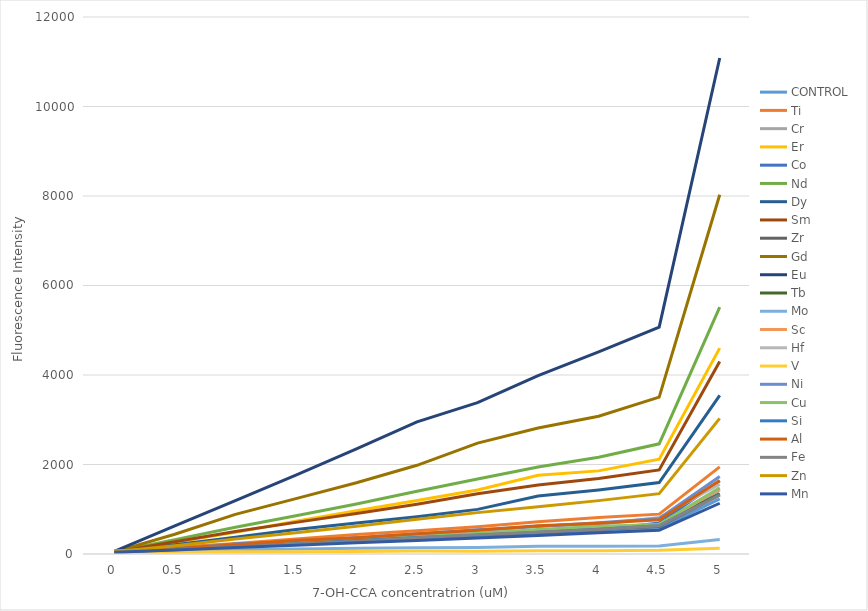
| Category | CONTROL | Ti | Cr | Er | Co | Nd | Dy | Sm | Zr | Gd | Eu | Tb | Mo | Sc | Hf | V | Ni | Cu | Si | Al | Fe | Zn | Mn |
|---|---|---|---|---|---|---|---|---|---|---|---|---|---|---|---|---|---|---|---|---|---|---|---|
| 0.0 | 39.667 | 56.333 | 40 | 38.667 | 37.667 | 49.667 | 44.667 | 47.333 | 48.667 | 48.333 | 56.333 | 35.667 | 69.667 | 48 | 53.333 | 37 | 36.333 | 40.333 | 41.333 | 39 | 36.667 | 50.333 | 40.667 |
| 0.5 | 103.333 | 151.667 | 113 | 261.333 | 97.667 | 321.667 | 208.333 | 272.667 | 112.667 | 442.333 | 626.667 | 99.333 | 83.667 | 120.333 | 125.667 | 46.333 | 119 | 107.333 | 106 | 123 | 94.667 | 186.667 | 88.333 |
| 1.0 | 157.333 | 236.333 | 185 | 483 | 222.667 | 599.667 | 372.667 | 503.667 | 179.333 | 885.333 | 1194.333 | 181 | 97 | 180.667 | 200.667 | 48.333 | 216.333 | 174.333 | 166.333 | 206.333 | 156 | 333.667 | 143 |
| 1.5 | 217.667 | 333 | 246.333 | 732.333 | 269.333 | 852.667 | 548.333 | 707 | 247 | 1237 | 1763.333 | 240.667 | 112 | 257 | 277.333 | 50 | 276 | 250 | 228.667 | 301.667 | 223.333 | 474.333 | 196.333 |
| 2.0 | 271 | 437 | 307.667 | 968.333 | 357.333 | 1116.667 | 691 | 903.333 | 307.333 | 1593 | 2349 | 303 | 126 | 329 | 350 | 57.667 | 362.333 | 314 | 300.333 | 363.667 | 284 | 619 | 248.667 |
| 2.5 | 330.333 | 518 | 384.333 | 1194.667 | 383.333 | 1403.333 | 830.333 | 1110.333 | 376 | 1982 | 2954.333 | 380.333 | 139.667 | 396 | 413.667 | 64.667 | 444.667 | 383.667 | 370 | 450.667 | 363.333 | 776.667 | 300.333 |
| 3.0 | 380.667 | 607.333 | 455.667 | 1429 | 431 | 1675.667 | 997.333 | 1348 | 428.333 | 2479 | 3383.667 | 442 | 145.333 | 458 | 491.333 | 63.333 | 543 | 460.667 | 420.667 | 531.667 | 432.333 | 924.667 | 355.667 |
| 3.5 | 453.667 | 723.333 | 512.667 | 1758.333 | 471 | 1943.667 | 1296.333 | 1542 | 496 | 2816.333 | 3988.333 | 493.333 | 171.667 | 530.667 | 624.333 | 72 | 614.667 | 546 | 483.333 | 630.333 | 488.667 | 1057.667 | 413.667 |
| 4.0 | 507.667 | 818.333 | 565.667 | 1857.333 | 537 | 2164 | 1431 | 1687.333 | 554.333 | 3079.333 | 4515.333 | 579 | 174.333 | 606.333 | 659 | 73.333 | 697.333 | 616 | 555.333 | 686.333 | 547 | 1192.667 | 474 |
| 4.5 | 571.333 | 890.667 | 647 | 2119.667 | 690.667 | 2462 | 1595.333 | 1878.333 | 614.667 | 3505.333 | 5068.667 | 649.667 | 180.333 | 661 | 815.667 | 83.333 | 795.333 | 662 | 628.667 | 764 | 630 | 1349.333 | 531.333 |
| 5.0 | 1231.333 | 1947.667 | 1439.333 | 4600 | 1633.667 | 5518.333 | 3544 | 4302.667 | 1318.333 | 8027 | 11084.333 | 1348.667 | 324.333 | 1456 | 1561.667 | 131 | 1732 | 1479 | 1328.667 | 1643.333 | 1316 | 3031.333 | 1134 |